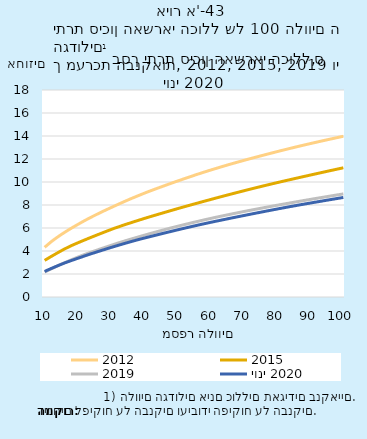
| Category | 2012 | 2015 | 2019 | יוני 2020 |
|---|---|---|---|---|
| 10.0 | 4.322 | 3.182 | 2.165 | 2.221 |
| 11.0 | 4.569 | 3.356 | 2.309 | 2.357 |
| 12.0 | 4.811 | 3.529 | 2.447 | 2.481 |
| 13.0 | 5.031 | 3.695 | 2.585 | 2.605 |
| 14.0 | 5.233 | 3.86 | 2.721 | 2.726 |
| 15.0 | 5.432 | 4.02 | 2.854 | 2.844 |
| 16.0 | 5.617 | 4.179 | 2.981 | 2.959 |
| 17.0 | 5.801 | 4.319 | 3.105 | 3.064 |
| 18.0 | 5.974 | 4.458 | 3.228 | 3.166 |
| 19.0 | 6.143 | 4.588 | 3.348 | 3.267 |
| 20.0 | 6.309 | 4.711 | 3.468 | 3.367 |
| 21.0 | 6.474 | 4.833 | 3.583 | 3.467 |
| 22.0 | 6.634 | 4.953 | 3.691 | 3.566 |
| 23.0 | 6.788 | 5.072 | 3.798 | 3.663 |
| 24.0 | 6.938 | 5.19 | 3.9 | 3.758 |
| 25.0 | 7.083 | 5.304 | 4.002 | 3.852 |
| 26.0 | 7.227 | 5.419 | 4.101 | 3.944 |
| 27.0 | 7.37 | 5.533 | 4.2 | 4.035 |
| 28.0 | 7.505 | 5.645 | 4.298 | 4.126 |
| 29.0 | 7.64 | 5.757 | 4.396 | 4.217 |
| 30.0 | 7.774 | 5.867 | 4.491 | 4.305 |
| 31.0 | 7.907 | 5.976 | 4.586 | 4.393 |
| 32.0 | 8.039 | 6.076 | 4.68 | 4.479 |
| 33.0 | 8.169 | 6.174 | 4.772 | 4.564 |
| 34.0 | 8.298 | 6.27 | 4.862 | 4.649 |
| 35.0 | 8.424 | 6.367 | 4.949 | 4.732 |
| 36.0 | 8.549 | 6.46 | 5.034 | 4.813 |
| 37.0 | 8.668 | 6.553 | 5.119 | 4.894 |
| 38.0 | 8.786 | 6.645 | 5.203 | 4.974 |
| 39.0 | 8.904 | 6.736 | 5.286 | 5.049 |
| 40.0 | 9.02 | 6.826 | 5.37 | 5.122 |
| 41.0 | 9.135 | 6.916 | 5.453 | 5.196 |
| 42.0 | 9.244 | 7.002 | 5.533 | 5.269 |
| 43.0 | 9.352 | 7.087 | 5.613 | 5.341 |
| 44.0 | 9.458 | 7.173 | 5.692 | 5.414 |
| 45.0 | 9.563 | 7.257 | 5.77 | 5.485 |
| 46.0 | 9.668 | 7.342 | 5.849 | 5.557 |
| 47.0 | 9.773 | 7.427 | 5.926 | 5.627 |
| 48.0 | 9.877 | 7.511 | 6 | 5.697 |
| 49.0 | 9.98 | 7.595 | 6.074 | 5.766 |
| 50.0 | 10.08 | 7.678 | 6.148 | 5.836 |
| 51.0 | 10.179 | 7.761 | 6.219 | 5.905 |
| 52.0 | 10.278 | 7.843 | 6.29 | 5.973 |
| 53.0 | 10.377 | 7.923 | 6.359 | 6.041 |
| 54.0 | 10.475 | 8.003 | 6.429 | 6.107 |
| 55.0 | 10.572 | 8.083 | 6.498 | 6.173 |
| 56.0 | 10.669 | 8.162 | 6.566 | 6.238 |
| 57.0 | 10.762 | 8.242 | 6.633 | 6.303 |
| 58.0 | 10.855 | 8.32 | 6.7 | 6.366 |
| 59.0 | 10.947 | 8.399 | 6.765 | 6.43 |
| 60.0 | 11.037 | 8.477 | 6.829 | 6.491 |
| 61.0 | 11.124 | 8.555 | 6.893 | 6.552 |
| 62.0 | 11.212 | 8.632 | 6.956 | 6.612 |
| 63.0 | 11.299 | 8.71 | 7.018 | 6.672 |
| 64.0 | 11.385 | 8.786 | 7.078 | 6.732 |
| 65.0 | 11.471 | 8.862 | 7.138 | 6.792 |
| 66.0 | 11.554 | 8.937 | 7.198 | 6.851 |
| 67.0 | 11.636 | 9.012 | 7.257 | 6.91 |
| 68.0 | 11.717 | 9.087 | 7.316 | 6.968 |
| 69.0 | 11.797 | 9.161 | 7.374 | 7.027 |
| 70.0 | 11.877 | 9.235 | 7.432 | 7.084 |
| 71.0 | 11.956 | 9.309 | 7.488 | 7.142 |
| 72.0 | 12.034 | 9.382 | 7.544 | 7.199 |
| 73.0 | 12.111 | 9.454 | 7.599 | 7.256 |
| 74.0 | 12.187 | 9.525 | 7.654 | 7.312 |
| 75.0 | 12.263 | 9.595 | 7.708 | 7.369 |
| 76.0 | 12.339 | 9.666 | 7.763 | 7.425 |
| 77.0 | 12.414 | 9.736 | 7.816 | 7.481 |
| 78.0 | 12.489 | 9.805 | 7.87 | 7.537 |
| 79.0 | 12.564 | 9.873 | 7.923 | 7.592 |
| 80.0 | 12.638 | 9.941 | 7.976 | 7.648 |
| 81.0 | 12.712 | 10.009 | 8.028 | 7.702 |
| 82.0 | 12.783 | 10.076 | 8.079 | 7.756 |
| 83.0 | 12.855 | 10.142 | 8.131 | 7.809 |
| 84.0 | 12.925 | 10.208 | 8.182 | 7.863 |
| 85.0 | 12.996 | 10.274 | 8.232 | 7.915 |
| 86.0 | 13.066 | 10.34 | 8.283 | 7.967 |
| 87.0 | 13.135 | 10.406 | 8.334 | 8.018 |
| 88.0 | 13.203 | 10.471 | 8.385 | 8.068 |
| 89.0 | 13.27 | 10.535 | 8.434 | 8.118 |
| 90.0 | 13.337 | 10.6 | 8.484 | 8.168 |
| 91.0 | 13.403 | 10.665 | 8.533 | 8.218 |
| 92.0 | 13.469 | 10.729 | 8.582 | 8.267 |
| 93.0 | 13.534 | 10.793 | 8.631 | 8.316 |
| 94.0 | 13.599 | 10.858 | 8.679 | 8.365 |
| 95.0 | 13.663 | 10.922 | 8.727 | 8.414 |
| 96.0 | 13.726 | 10.985 | 8.775 | 8.462 |
| 97.0 | 13.789 | 11.048 | 8.822 | 8.51 |
| 98.0 | 13.851 | 11.11 | 8.87 | 8.559 |
| 99.0 | 13.914 | 11.173 | 8.916 | 8.607 |
| 100.0 | 13.976 | 11.235 | 8.963 | 8.654 |